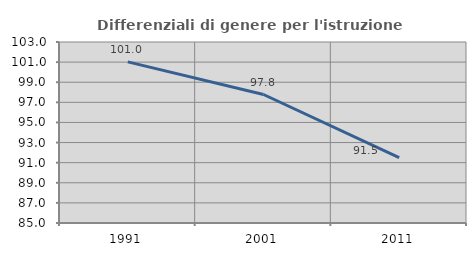
| Category | Differenziali di genere per l'istruzione superiore |
|---|---|
| 1991.0 | 101.026 |
| 2001.0 | 97.779 |
| 2011.0 | 91.507 |